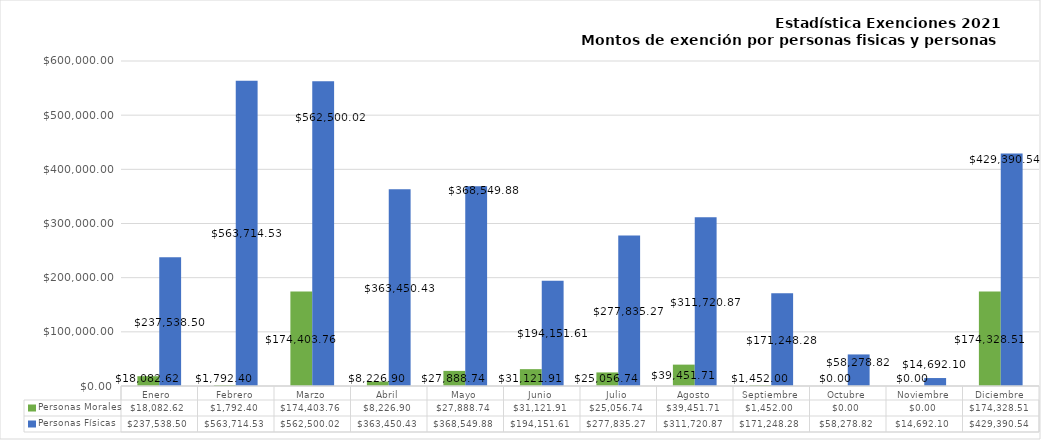
| Category | Personas Morales | Personas Físicas |
|---|---|---|
| Enero  | 18082.62 | 237538.5 |
| Febrero | 1792.4 | 563714.53 |
| Marzo | 174403.76 | 562500.02 |
| Abril | 8226.9 | 363450.43 |
| Mayo | 27888.74 | 368549.88 |
| Junio | 31121.91 | 194151.61 |
| Julio | 25056.74 | 277835.27 |
| Agosto | 39451.71 | 311720.87 |
| Septiembre | 1452 | 171248.28 |
| Octubre | 0 | 58278.82 |
| Noviembre | 0 | 14692.1 |
| Diciembre | 174328.51 | 429390.54 |